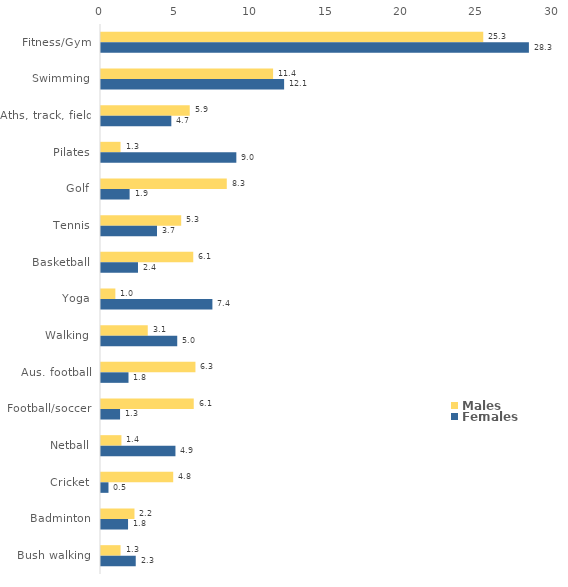
| Category | Males | Females |
|---|---|---|
| Fitness/Gym | 25.315 | 28.338 |
| Swimming | 11.397 | 12.127 |
| Aths, track, field | 5.877 | 4.658 |
| Pilates | 1.294 | 8.963 |
| Golf | 8.33 | 1.895 |
| Tennis | 5.311 | 3.709 |
| Basketball | 6.11 | 2.45 |
| Yoga | 0.951 | 7.377 |
| Walking | 3.097 | 5.049 |
| Aus. football | 6.255 | 1.821 |
| Football/soccer | 6.142 | 1.262 |
| Netball | 1.353 | 4.931 |
| Cricket | 4.782 | 0.495 |
| Badminton | 2.217 | 1.791 |
| Bush walking | 1.296 | 2.301 |